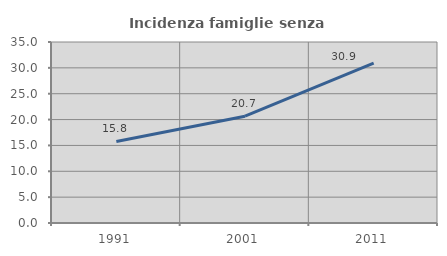
| Category | Incidenza famiglie senza nuclei |
|---|---|
| 1991.0 | 15.774 |
| 2001.0 | 20.659 |
| 2011.0 | 30.921 |